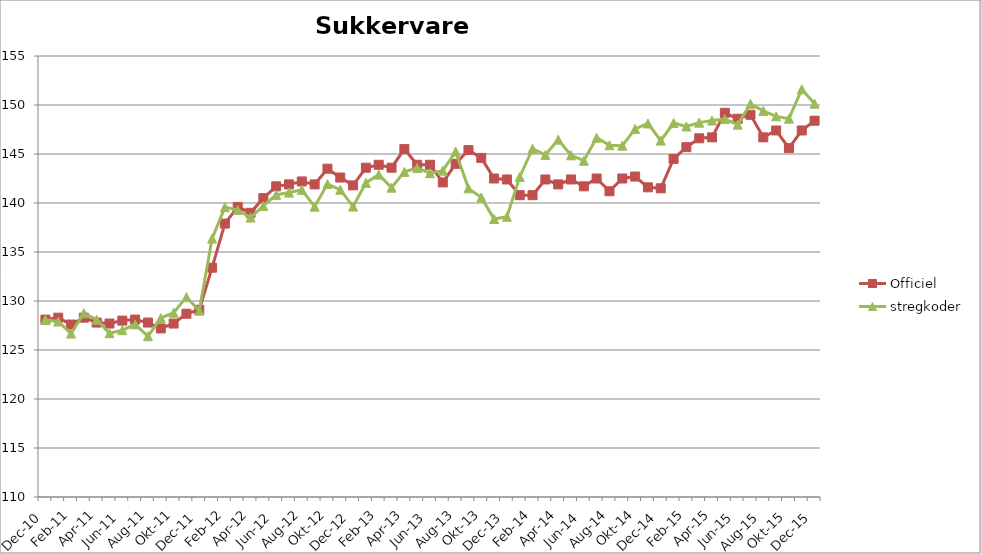
| Category | Officiel | stregkoder |
|---|---|---|
|  Dec-10 | 128.1 | 128.085 |
|  Jan-11 | 128.3 | 127.909 |
|  Feb-11 | 127.6 | 126.68 |
|  Mar-11 | 128.3 | 128.749 |
|  Apr-11 | 127.8 | 128.091 |
|  Maj-11 | 127.7 | 126.709 |
|  Jun-11 | 128 | 127.019 |
|  Jul-11 | 128.1 | 127.616 |
|  Aug-11 | 127.8 | 126.403 |
|  Sep-11 | 127.2 | 128.259 |
|  Okt-11 | 127.7 | 128.801 |
|  Nov-11 | 128.7 | 130.396 |
|  Dec-11 | 129.1 | 129.014 |
|  Jan-12 | 133.4 | 136.37 |
|  Feb-12 | 137.9 | 139.576 |
|  Mar-12 | 139.6 | 139.303 |
|  Apr-12 | 139 | 138.515 |
|  Maj-12 | 140.5 | 139.701 |
|  Jun-12 | 141.7 | 140.83 |
|  Jul-12 | 141.9 | 141.064 |
|  Aug-12 | 142.2 | 141.343 |
|  Sep-12 | 141.9 | 139.627 |
|  Okt-12 | 143.5 | 141.932 |
|  Nov-12 | 142.6 | 141.357 |
|  Dec-12 | 141.8 | 139.635 |
|  Jan-13 | 143.6 | 142.058 |
|  Feb-13 | 143.9 | 142.896 |
|  Mar-13 | 143.6 | 141.565 |
|  Apr-13 | 145.5 | 143.176 |
|  Maj-13 | 143.9 | 143.577 |
|  Jun-13 | 143.9 | 143.047 |
|  Jul-13 | 142.1 | 143.302 |
|  Aug-13 | 144 | 145.252 |
|  Sep-13 | 145.4 | 141.493 |
|  Okt-13 | 144.6 | 140.565 |
|  Nov-13 | 142.5 | 138.365 |
|  Dec-13 | 142.4 | 138.598 |
|  Jan-14 | 140.8 | 142.661 |
|  Feb-14 | 140.8 | 145.539 |
|  Mar-14 | 142.4 | 144.906 |
|  Apr-14 | 141.9 | 146.458 |
|  Maj-14 | 142.4 | 144.867 |
|  Jun-14 | 141.7 | 144.314 |
|  Jul-14 | 142.5 | 146.664 |
|  Aug-14 | 141.2 | 145.888 |
|  Sep-14 | 142.5 | 145.851 |
|  Okt-14 | 142.7 | 147.56 |
|  Nov-14 | 141.6 | 148.117 |
|  Dec-14 | 141.5 | 146.366 |
|  Jan-15 | 144.5 | 148.161 |
|  Feb-15 | 145.7 | 147.807 |
|  Mar-15 | 146.6 | 148.201 |
|  Apr-15 | 146.7 | 148.416 |
|  Maj-15 | 149.2 | 148.558 |
| Jun-15 | 148.6 | 147.997 |
| Jul-15 | 149 | 150.121 |
| Aug-15 | 146.7 | 149.398 |
| Sep-15 | 147.4 | 148.841 |
| Okt-15 | 145.6 | 148.604 |
| Nov-15 | 147.4 | 151.601 |
| Dec-15 | 148.401 | 150.135 |